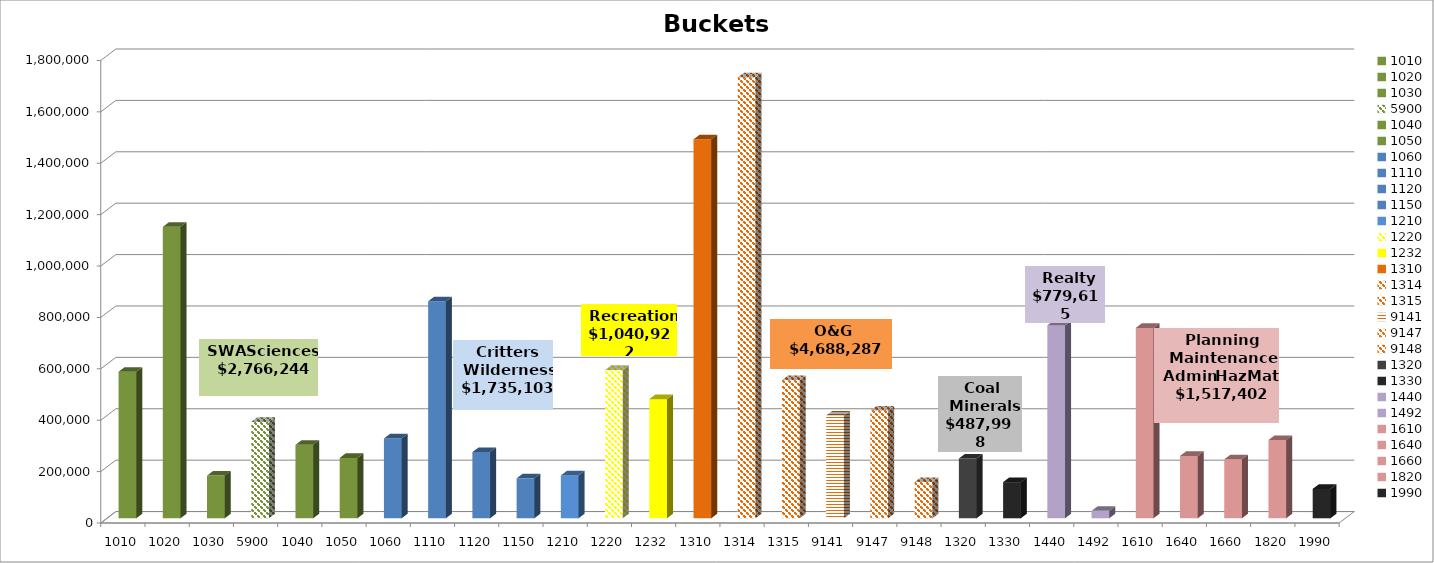
| Category | Budget $ |
|---|---|
| 1010.0 | 570301 |
| 1020.0 | 1134086 |
| 1030.0 | 166109 |
| 5900.0 | 375000 |
| 1040.0 | 285758 |
| 1050.0 | 234990 |
| 1060.0 | 310747 |
| 1110.0 | 844622 |
| 1120.0 | 257478 |
| 1150.0 | 155515 |
| 1210.0 | 166741 |
| 1220.0 | 577271 |
| 1232.0 | 463651 |
| 1310.0 | 1474729 |
| 1314.0 | 1715526 |
| 1315.0 | 537354 |
| 9141.0 | 400000 |
| 9147.0 | 419541 |
| 9148.0 | 141137 |
| 1320.0 | 232715 |
| 1330.0 | 140838 |
| 1440.0 | 750715 |
| 1492.0 | 28900 |
| 1610.0 | 740887 |
| 1640.0 | 242666 |
| 1660.0 | 229379 |
| 1820.0 | 304470 |
| 1990.0 | 114445 |